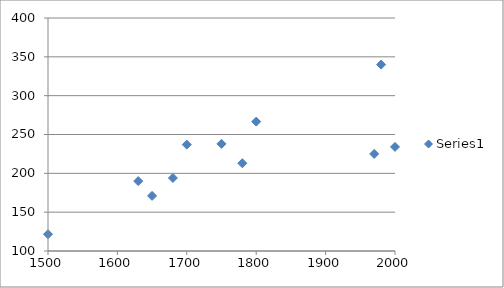
| Category | Series 0 |
|---|---|
| 1500.0 | 121.58 |
| 1630.0 | 190 |
| 1650.0 | 171 |
| 1680.0 | 194 |
| 1700.0 | 237 |
| 1750.0 | 238 |
| 1780.0 | 213 |
| 1800.0 | 266.6 |
| 1970.0 | 225 |
| 1980.0 | 340 |
| 2000.0 | 234 |